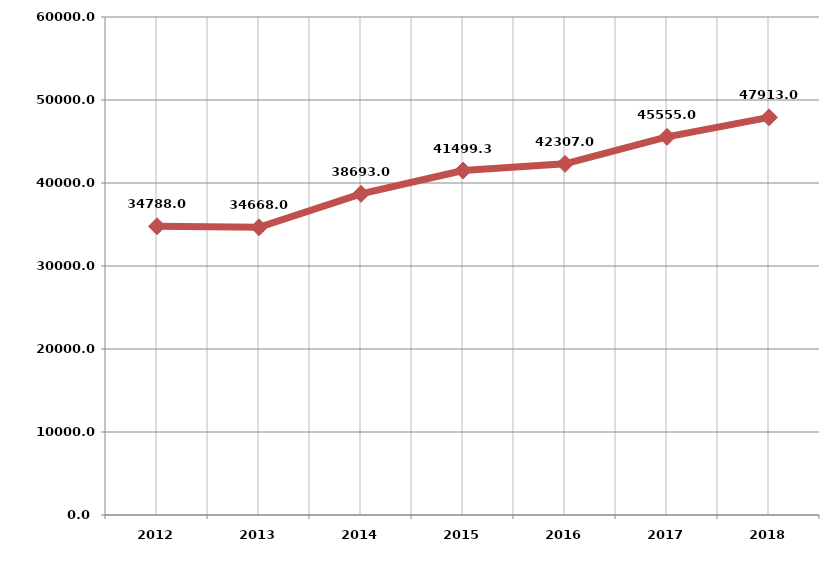
| Category | الطاقة المولــــدة
 [جبجا واط . ساعة) Generation (GWH) |
|---|---|
| 2012.0 | 34788 |
| 2013.0 | 34668 |
| 2014.0 | 38693 |
| 2015.0 | 41499.3 |
| 2016.0 | 42307 |
| 2017.0 | 45555 |
| 2018.0 | 47913 |